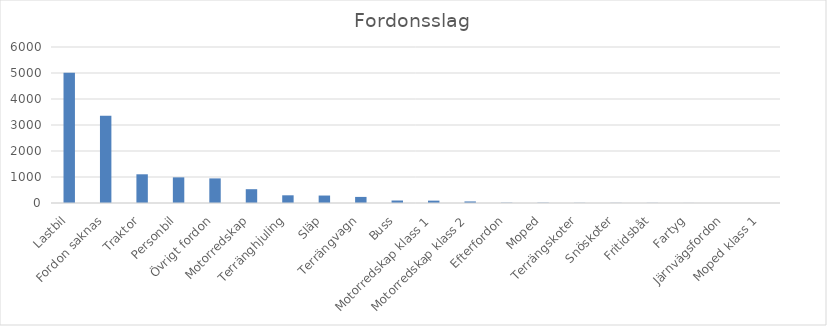
| Category | Summa |
|---|---|
| Lastbil | 5012 |
| Fordon saknas | 3358 |
| Traktor | 1104 |
| Personbil | 986 |
| Övrigt fordon | 946 |
| Motorredskap | 531 |
| Terränghjuling | 296 |
| Släp | 287 |
| Terrängvagn | 234 |
| Buss | 96 |
| Motorredskap klass 1 | 91 |
| Motorredskap klass 2 | 60 |
| Efterfordon | 11 |
| Moped | 11 |
| Terrängskoter | 6 |
| Snöskoter | 5 |
| Fritidsbåt | 5 |
| Fartyg | 2 |
| Järnvägsfordon | 1 |
| Moped klass 1 | 1 |